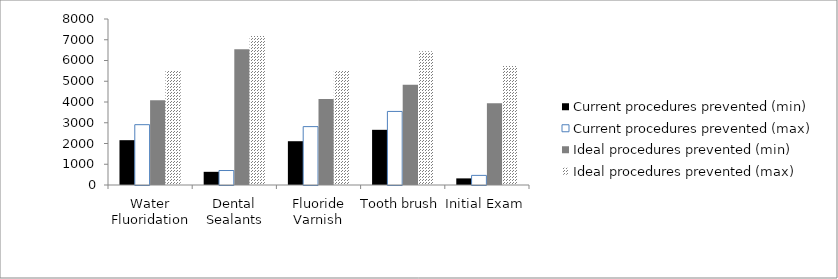
| Category | Current procedures prevented (min) | Current procedures prevented (max) | Ideal procedures prevented (min) | Ideal procedures prevented (max) |
|---|---|---|---|---|
| Water Fluoridation | 2159.748 | 2907.354 | 4089.341 | 5504.882 |
| Dental Sealants | 634.852 | 697.443 | 6538.975 | 7183.663 |
| Fluoride Varnish | 2110.033 | 2813.378 | 4144.421 | 5525.894 |
| Tooth brush | 2659.337 | 3545.782 | 4835.158 | 6446.877 |
| Initial Exam | 318.678 | 463.531 | 3944.13 | 5736.916 |